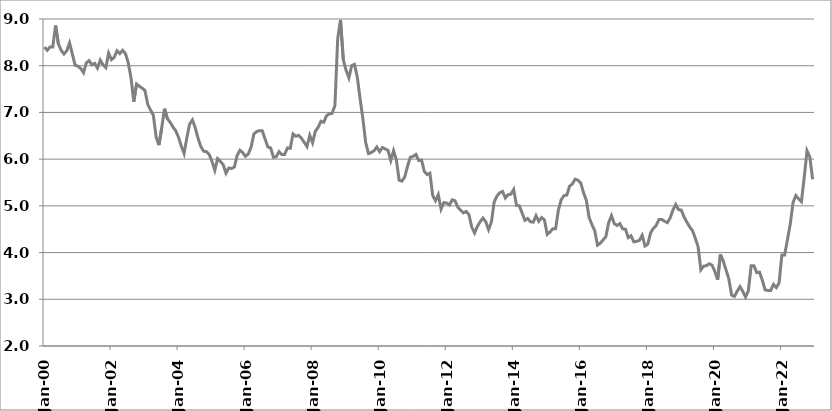
| Category | Series 1 |
|---|---|
| 2000-01-01 | 8.4 |
| 2000-02-01 | 8.33 |
| 2000-03-01 | 8.4 |
| 2000-04-01 | 8.4 |
| 2000-05-01 | 8.86 |
| 2000-06-01 | 8.47 |
| 2000-07-01 | 8.33 |
| 2000-08-01 | 8.25 |
| 2000-09-01 | 8.32 |
| 2000-10-01 | 8.49 |
| 2000-11-01 | 8.25 |
| 2000-12-01 | 8.01 |
| 2001-01-01 | 7.99 |
| 2001-02-01 | 7.94 |
| 2001-03-01 | 7.85 |
| 2001-04-01 | 8.06 |
| 2001-05-01 | 8.11 |
| 2001-06-01 | 8.02 |
| 2001-07-01 | 8.05 |
| 2001-08-01 | 7.95 |
| 2001-09-01 | 8.12 |
| 2001-10-01 | 8.02 |
| 2001-11-01 | 7.96 |
| 2001-12-01 | 8.27 |
| 2002-01-01 | 8.13 |
| 2002-02-01 | 8.18 |
| 2002-03-01 | 8.32 |
| 2002-04-01 | 8.26 |
| 2002-05-01 | 8.33 |
| 2002-06-01 | 8.26 |
| 2002-07-01 | 8.07 |
| 2002-08-01 | 7.74 |
| 2002-09-01 | 7.23 |
| 2002-10-01 | 7.61 |
| 2002-11-01 | 7.56 |
| 2002-12-01 | 7.52 |
| 2003-01-01 | 7.47 |
| 2003-02-01 | 7.17 |
| 2003-03-01 | 7.05 |
| 2003-04-01 | 6.94 |
| 2003-05-01 | 6.47 |
| 2003-06-01 | 6.3 |
| 2003-07-01 | 6.67 |
| 2003-08-01 | 7.08 |
| 2003-09-01 | 6.87 |
| 2003-10-01 | 6.79 |
| 2003-11-01 | 6.69 |
| 2003-12-01 | 6.61 |
| 2004-01-01 | 6.47 |
| 2004-02-01 | 6.28 |
| 2004-03-01 | 6.12 |
| 2004-04-01 | 6.46 |
| 2004-05-01 | 6.75 |
| 2004-06-01 | 6.84 |
| 2004-07-01 | 6.67 |
| 2004-08-01 | 6.45 |
| 2004-09-01 | 6.27 |
| 2004-10-01 | 6.17 |
| 2004-11-01 | 6.16 |
| 2004-12-01 | 6.1 |
| 2005-01-01 | 5.95 |
| 2005-02-01 | 5.76 |
| 2005-03-01 | 6.01 |
| 2005-04-01 | 5.95 |
| 2005-05-01 | 5.88 |
| 2005-06-01 | 5.7 |
| 2005-07-01 | 5.81 |
| 2005-08-01 | 5.8 |
| 2005-09-01 | 5.83 |
| 2005-10-01 | 6.08 |
| 2005-11-01 | 6.19 |
| 2005-12-01 | 6.14 |
| 2006-01-01 | 6.06 |
| 2006-02-01 | 6.11 |
| 2006-03-01 | 6.26 |
| 2006-04-01 | 6.54 |
| 2006-05-01 | 6.59 |
| 2006-06-01 | 6.61 |
| 2006-07-01 | 6.61 |
| 2006-08-01 | 6.43 |
| 2006-09-01 | 6.26 |
| 2006-10-01 | 6.24 |
| 2006-11-01 | 6.04 |
| 2006-12-01 | 6.05 |
| 2007-01-01 | 6.16 |
| 2007-02-01 | 6.1 |
| 2007-03-01 | 6.1 |
| 2007-04-01 | 6.24 |
| 2007-05-01 | 6.23 |
| 2007-06-01 | 6.54 |
| 2007-07-01 | 6.49 |
| 2007-08-01 | 6.51 |
| 2007-09-01 | 6.45 |
| 2007-10-01 | 6.36 |
| 2007-11-01 | 6.27 |
| 2007-12-01 | 6.51 |
| 2008-01-01 | 6.35 |
| 2008-02-01 | 6.6 |
| 2008-03-01 | 6.68 |
| 2008-04-01 | 6.81 |
| 2008-05-01 | 6.79 |
| 2008-06-01 | 6.93 |
| 2008-07-01 | 6.97 |
| 2008-08-01 | 6.98 |
| 2008-09-01 | 7.15 |
| 2008-10-01 | 8.58 |
| 2008-11-01 | 8.98 |
| 2008-12-01 | 8.13 |
| 2009-01-01 | 7.9 |
| 2009-02-01 | 7.74 |
| 2009-03-01 | 8 |
| 2009-04-01 | 8.03 |
| 2009-05-01 | 7.76 |
| 2009-06-01 | 7.3 |
| 2009-07-01 | 6.87 |
| 2009-08-01 | 6.36 |
| 2009-09-01 | 6.12 |
| 2009-10-01 | 6.14 |
| 2009-11-01 | 6.18 |
| 2009-12-01 | 6.26 |
| 2010-01-01 | 6.16 |
| 2010-02-01 | 6.25 |
| 2010-03-01 | 6.22 |
| 2010-04-01 | 6.19 |
| 2010-05-01 | 5.97 |
| 2010-06-01 | 6.18 |
| 2010-07-01 | 5.98 |
| 2010-08-01 | 5.55 |
| 2010-09-01 | 5.53 |
| 2010-10-01 | 5.62 |
| 2010-11-01 | 5.85 |
| 2010-12-01 | 6.04 |
| 2011-01-01 | 6.06 |
| 2011-02-01 | 6.1 |
| 2011-03-01 | 5.97 |
| 2011-04-01 | 5.98 |
| 2011-05-01 | 5.74 |
| 2011-06-01 | 5.67 |
| 2011-07-01 | 5.7 |
| 2011-08-01 | 5.22 |
| 2011-09-01 | 5.11 |
| 2011-10-01 | 5.24 |
| 2011-11-01 | 4.93 |
| 2011-12-01 | 5.07 |
| 2012-01-01 | 5.06 |
| 2012-02-01 | 5.02 |
| 2012-03-01 | 5.13 |
| 2012-04-01 | 5.11 |
| 2012-05-01 | 4.97 |
| 2012-06-01 | 4.91 |
| 2012-07-01 | 4.85 |
| 2012-08-01 | 4.88 |
| 2012-09-01 | 4.81 |
| 2012-10-01 | 4.54 |
| 2012-11-01 | 4.42 |
| 2012-12-01 | 4.56 |
| 2013-01-01 | 4.66 |
| 2013-02-01 | 4.74 |
| 2013-03-01 | 4.66 |
| 2013-04-01 | 4.49 |
| 2013-05-01 | 4.65 |
| 2013-06-01 | 5.08 |
| 2013-07-01 | 5.21 |
| 2013-08-01 | 5.28 |
| 2013-09-01 | 5.31 |
| 2013-10-01 | 5.17 |
| 2013-11-01 | 5.24 |
| 2013-12-01 | 5.25 |
| 2014-01-01 | 5.351 |
| 2014-02-01 | 5.01 |
| 2014-03-01 | 5 |
| 2014-04-01 | 4.85 |
| 2014-05-01 | 4.69 |
| 2014-06-01 | 4.73 |
| 2014-07-01 | 4.66 |
| 2014-08-01 | 4.65 |
| 2014-09-01 | 4.79 |
| 2014-10-01 | 4.67 |
| 2014-11-01 | 4.75 |
| 2014-12-01 | 4.7 |
| 2015-01-01 | 4.39 |
| 2015-02-01 | 4.44 |
| 2015-03-01 | 4.51 |
| 2015-04-01 | 4.51 |
| 2015-05-01 | 4.91 |
| 2015-06-01 | 5.13 |
| 2015-07-01 | 5.22 |
| 2015-08-01 | 5.23 |
| 2015-09-01 | 5.42 |
| 2015-10-01 | 5.47 |
| 2015-11-01 | 5.57 |
| 2015-12-01 | 5.55 |
| 2016-01-01 | 5.49 |
| 2016-02-01 | 5.28 |
| 2016-03-01 | 5.12 |
| 2016-04-01 | 4.75 |
| 2016-05-01 | 4.6 |
| 2016-06-01 | 4.47 |
| 2016-07-01 | 4.16 |
| 2016-08-01 | 4.2 |
| 2016-09-01 | 4.27 |
| 2016-10-01 | 4.34 |
| 2016-11-01 | 4.64 |
| 2016-12-01 | 4.79 |
| 2017-01-01 | 4.62 |
| 2017-02-01 | 4.58 |
| 2017-03-01 | 4.62 |
| 2017-04-01 | 4.51 |
| 2017-05-01 | 4.5 |
| 2017-06-01 | 4.32 |
| 2017-07-01 | 4.36 |
| 2017-08-01 | 4.23 |
| 2017-09-01 | 4.24 |
| 2017-10-01 | 4.26 |
| 2017-11-01 | 4.37 |
| 2017-12-01 | 4.14 |
| 2018-01-01 | 4.18 |
| 2018-02-01 | 4.42 |
| 2018-03-01 | 4.52 |
| 2018-04-01 | 4.58 |
| 2018-05-01 | 4.71 |
| 2018-06-01 | 4.71 |
| 2018-07-01 | 4.67 |
| 2018-08-01 | 4.64 |
| 2018-09-01 | 4.74 |
| 2018-10-01 | 4.91 |
| 2018-11-01 | 5.03 |
| 2018-12-01 | 4.92 |
| 2019-01-01 | 4.91 |
| 2019-02-01 | 4.76 |
| 2019-03-01 | 4.65 |
| 2019-04-01 | 4.55 |
| 2019-05-01 | 4.47 |
| 2019-06-01 | 4.31 |
| 2019-07-01 | 4.13 |
| 2019-08-01 | 3.63 |
| 2019-09-01 | 3.71 |
| 2019-10-01 | 3.72 |
| 2019-11-01 | 3.76 |
| 2019-12-01 | 3.73 |
| 2020-01-01 | 3.6 |
| 2020-02-01 | 3.42 |
| 2020-03-01 | 3.96 |
| 2020-04-01 | 3.82 |
| 2020-05-01 | 3.63 |
| 2020-06-01 | 3.44 |
| 2020-07-01 | 3.09 |
| 2020-08-01 | 3.06 |
| 2020-09-01 | 3.17 |
| 2020-10-01 | 3.27 |
| 2020-11-01 | 3.17 |
| 2020-12-01 | 3.05 |
| 2021-01-01 | 3.18 |
| 2021-02-01 | 3.72 |
| 2021-03-01 | 3.72 |
| 2021-04-01 | 3.57 |
| 2021-05-01 | 3.58 |
| 2021-06-01 | 3.41 |
| 2021-07-01 | 3.2 |
| 2021-08-01 | 3.19 |
| 2021-09-01 | 3.19 |
| 2021-10-01 | 3.32 |
| 2021-11-01 | 3.25 |
| 2021-12-01 | 3.35 |
| 2022-01-01 | 3.95 |
| 2022-02-01 | 3.95 |
| 2022-03-01 | 4.28 |
| 2022-04-01 | 4.61 |
| 2022-05-01 | 5.07 |
| 2022-06-01 | 5.22 |
| 2022-07-01 | 5.15 |
| 2022-08-01 | 5.09 |
| 2022-09-01 | 5.61 |
| 2022-10-01 | 6.18 |
| 2022-11-01 | 6.05 |
| 2022-12-01 | 5.57 |